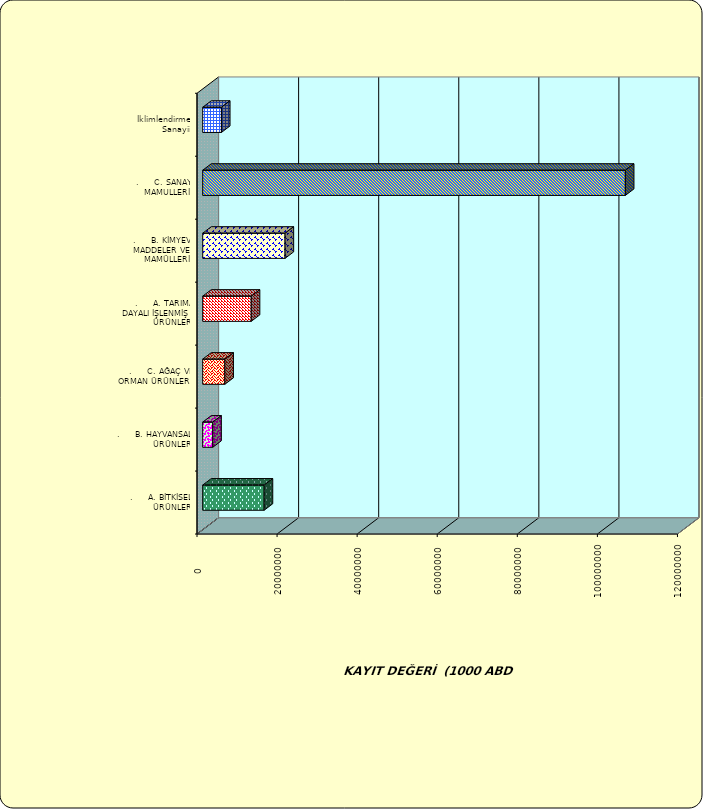
| Category | Series 0 |
|---|---|
| .     A. BİTKİSEL ÜRÜNLER | 15348590.843 |
| .     B. HAYVANSAL ÜRÜNLER | 2514131.746 |
| .     C. AĞAÇ VE ORMAN ÜRÜNLERİ | 5531789.598 |
| .     A. TARIMA DAYALI İŞLENMİŞ ÜRÜNLER | 12121898.657 |
| .     B. KİMYEVİ MADDELER VE MAMÜLLERİ | 20570444.491 |
| .     C. SANAYİ MAMULLERİ | 105561315.365 |
|  İklimlendirme Sanayii | 4679065.658 |